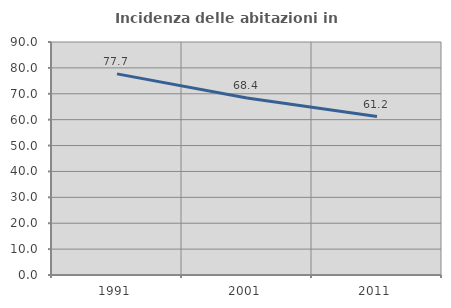
| Category | Incidenza delle abitazioni in proprietà  |
|---|---|
| 1991.0 | 77.691 |
| 2001.0 | 68.359 |
| 2011.0 | 61.189 |